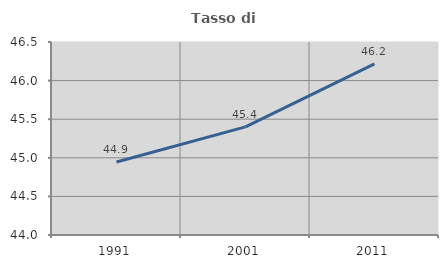
| Category | Tasso di occupazione   |
|---|---|
| 1991.0 | 44.945 |
| 2001.0 | 45.401 |
| 2011.0 | 46.218 |